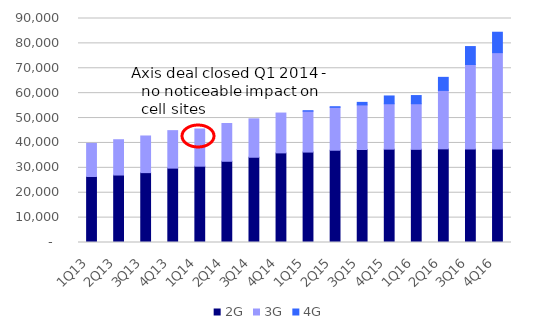
| Category | 2G | 3G | 4G |
|---|---|---|---|
| 1Q13 | 26524 | 13295 | 0 |
| 2Q13 | 27107 | 14186 | 0 |
| 3Q13 | 28074 | 14722 | 0 |
| 4Q13 | 29878 | 15068 | 0 |
| 1Q14 | 30655 | 14945 | 0 |
| 2Q14 | 32635 | 15179 | 0 |
| 3Q14 | 34253 | 15429 | 0 |
| 4Q14 | 36006 | 16006 | 0 |
| 1Q15 | 36331 | 16431 | 180 |
| 2Q15 | 37072 | 17246 | 232 |
| 3Q15 | 37364 | 17918 | 1018 |
| 4Q15 | 37506 | 18239 | 3134 |
| 1Q16 | 37430 | 18324 | 3286 |
| 2Q16 | 37629 | 23474 | 5250 |
| 3Q16 | 37582 | 33939 | 7204 |
| 4Q16 | 37549 | 38731 | 8204 |